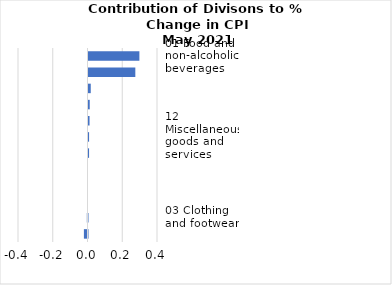
| Category |     Contributions |
|---|---|
| 01 Food and non-alcoholic beverages | 0.293 |
| 07 Transport | 0.27 |
| 04 Housing, water, electricity, gas and other fuels | 0.013 |
| 09 Recreation and culture | 0.007 |
| 02 Alcoholic beverages, tobacco and narcotics | 0.006 |
| 12 Miscellaneous goods and services | 0.003 |
| 06 Health | 0.003 |
| 08 Communication | 0 |
| 11 Restaurants and hotels | 0 |
| 10 Education | 0 |
| 03 Clothing and footwear | -0.004 |
| 05 Furnishings, household equipment and routine household maintenance | -0.021 |